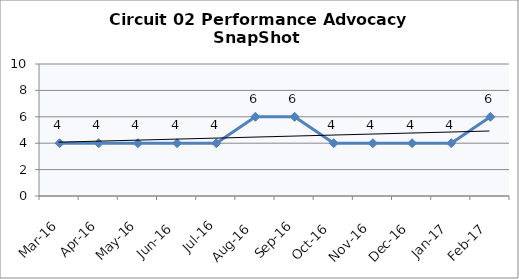
| Category | Circuit 02 |
|---|---|
| Mar-16 | 4 |
| Apr-16 | 4 |
| May-16 | 4 |
| Jun-16 | 4 |
| Jul-16 | 4 |
| Aug-16 | 6 |
| Sep-16 | 6 |
| Oct-16 | 4 |
| Nov-16 | 4 |
| Dec-16 | 4 |
| Jan-17 | 4 |
| Feb-17 | 6 |